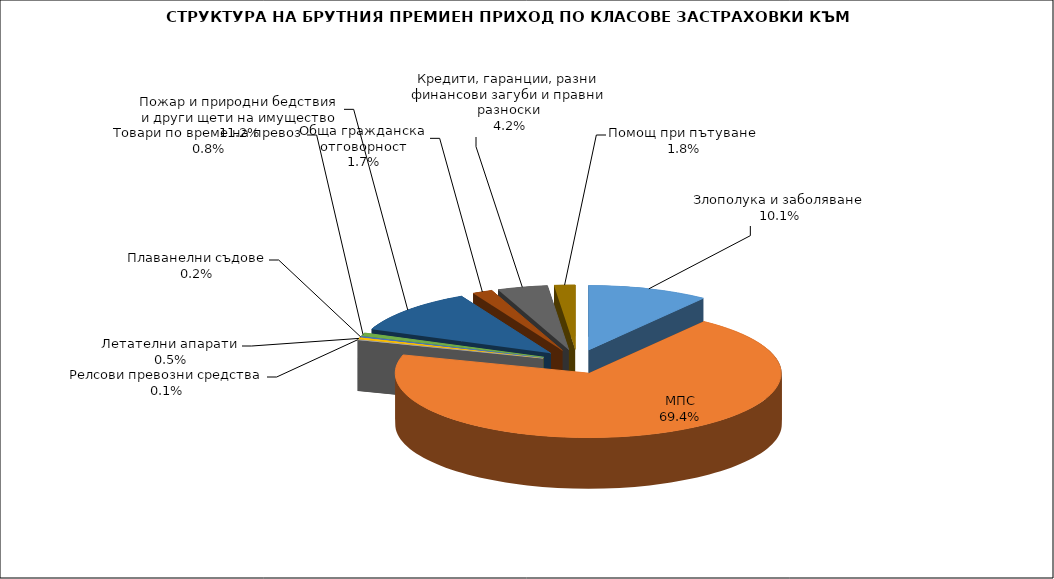
| Category | Злополука и заболяване |
|---|---|
| Злополука и заболяване | 0.101 |
| МПС | 0.694 |
| Релсови превозни средства | 0.001 |
| Летателни апарати | 0.005 |
| Плаванелни съдове | 0.002 |
| Товари по време на превоз | 0.008 |
| Пожар и природни бедствия и други щети на имущество | 0.112 |
| Обща гражданска отговорност | 0.017 |
| Кредити, гаранции, разни финансови загуби и правни разноски | 0.042 |
| Помощ при пътуване | 0.018 |